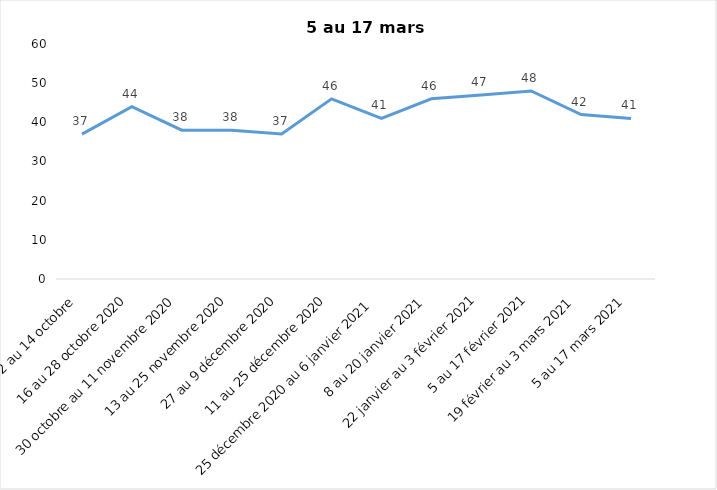
| Category | Toujours aux trois mesures |
|---|---|
| 2 au 14 octobre  | 37 |
| 16 au 28 octobre 2020 | 44 |
| 30 octobre au 11 novembre 2020 | 38 |
| 13 au 25 novembre 2020 | 38 |
| 27 au 9 décembre 2020 | 37 |
| 11 au 25 décembre 2020 | 46 |
| 25 décembre 2020 au 6 janvier 2021 | 41 |
| 8 au 20 janvier 2021 | 46 |
| 22 janvier au 3 février 2021 | 47 |
| 5 au 17 février 2021 | 48 |
| 19 février au 3 mars 2021 | 42 |
| 5 au 17 mars 2021 | 41 |